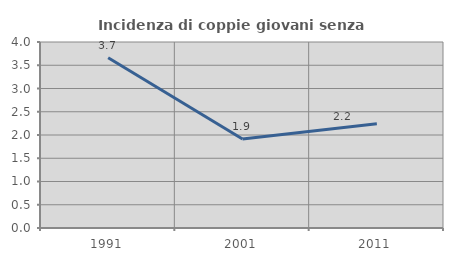
| Category | Incidenza di coppie giovani senza figli |
|---|---|
| 1991.0 | 3.663 |
| 2001.0 | 1.916 |
| 2011.0 | 2.242 |